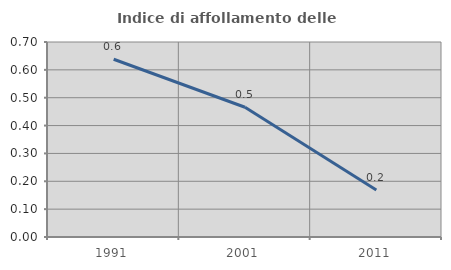
| Category | Indice di affollamento delle abitazioni  |
|---|---|
| 1991.0 | 0.638 |
| 2001.0 | 0.466 |
| 2011.0 | 0.169 |